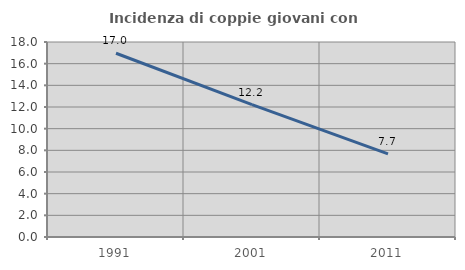
| Category | Incidenza di coppie giovani con figli |
|---|---|
| 1991.0 | 16.961 |
| 2001.0 | 12.216 |
| 2011.0 | 7.669 |